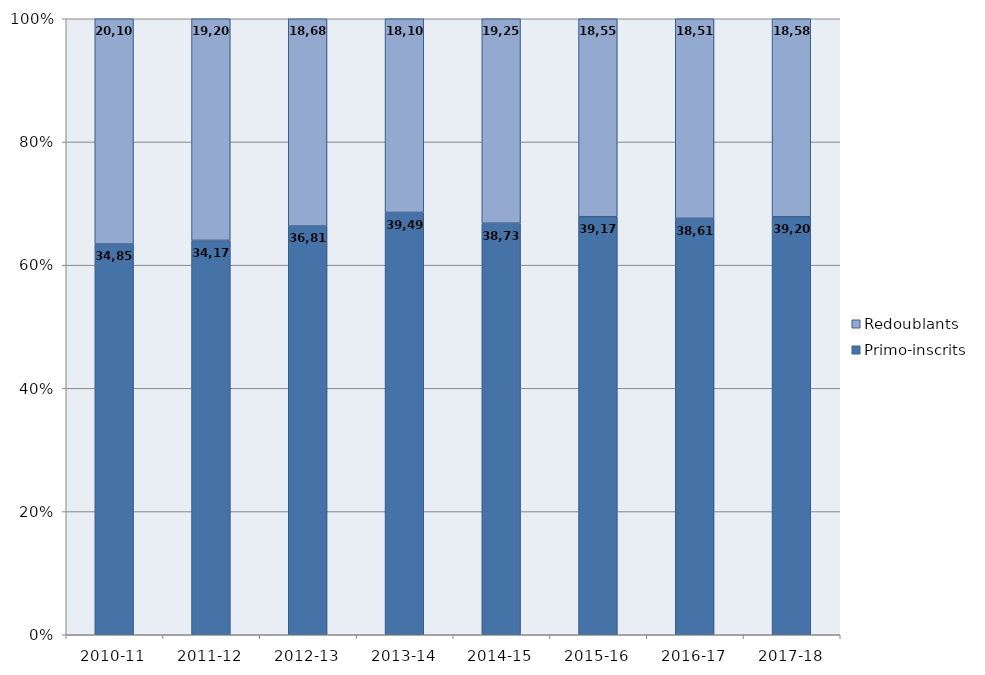
| Category | Primo-inscrits | Redoublants |
|---|---|---|
| 2010-11 | 34858 | 20103 |
| 2011-12 | 34179 | 19208 |
| 2012-13 | 36819 | 18681 |
| 2013-14 | 39491 | 18107 |
| 2014-15 | 38735 | 19251 |
| 2015-16 | 39171 | 18551 |
| 2016-17 | 38616 | 18511 |
| 2017-18 | 39209 | 18582 |